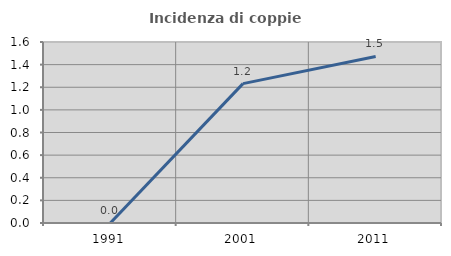
| Category | Incidenza di coppie miste |
|---|---|
| 1991.0 | 0 |
| 2001.0 | 1.232 |
| 2011.0 | 1.472 |